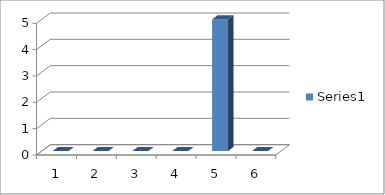
| Category | Series 0 |
|---|---|
| 0 | 0 |
| 1 | 0 |
| 2 | 0 |
| 3 | 0 |
| 4 | 5 |
| 5 | 0 |